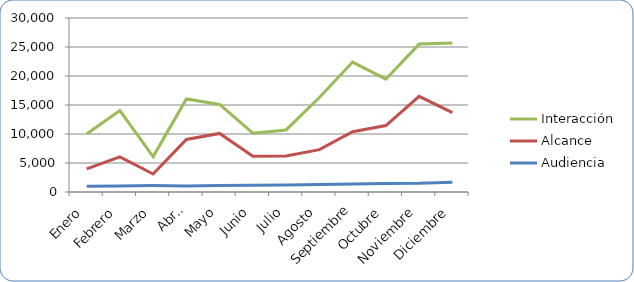
| Category | Audiencia | Alcance | Interacción |
|---|---|---|---|
| Enero | 1000 | 3000 | 6000 |
| Febrero | 1050 | 5000 | 8000 |
| Marzo | 1100 | 2000 | 3000 |
| Abril | 1050 | 8000 | 7000 |
| Mayo | 1100 | 9000 | 5000 |
| Junio | 1150 | 5000 | 4000 |
| Julio | 1200 | 5000 | 4500 |
| Agosto | 1300 | 6000 | 9000 |
| Septiembre | 1400 | 9000 | 12000 |
| Octubre | 1450 | 10000 | 8000 |
| Noviembre | 1500 | 15000 | 9000 |
| Diciembre | 1700 | 12000 | 12000 |